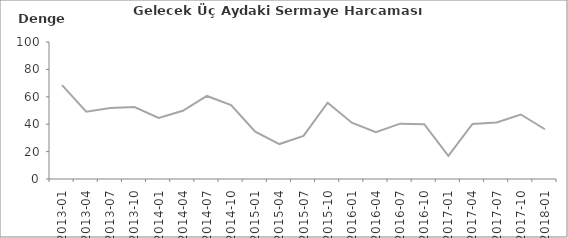
| Category | Gelecek Üç Aydaki Sermaye Harcaması Beklentisi |
|---|---|
| 2013-01 | 68.5 |
| 2013-04 | 49.1 |
| 2013-07 | 51.9 |
| 2013-10 | 52.5 |
| 2014-01 | 44.6 |
| 2014-04 | 49.8 |
| 2014-07 | 60.6 |
| 2014-10 | 53.9 |
| 2015-01 | 34.5 |
| 2015-04 | 25.5 |
| 2015-07 | 31.5 |
| 2015-10 | 55.7 |
| 2016-01 | 41.1 |
| 2016-04 | 34.2 |
| 2016-07 | 40.4 |
| 2016-10 | 40 |
| 2017-01 | 16.9 |
| 2017-04 | 40.2 |
| 2017-07 | 41.2 |
| 2017-10 | 47.1 |
| 2018-01 | 36.3 |